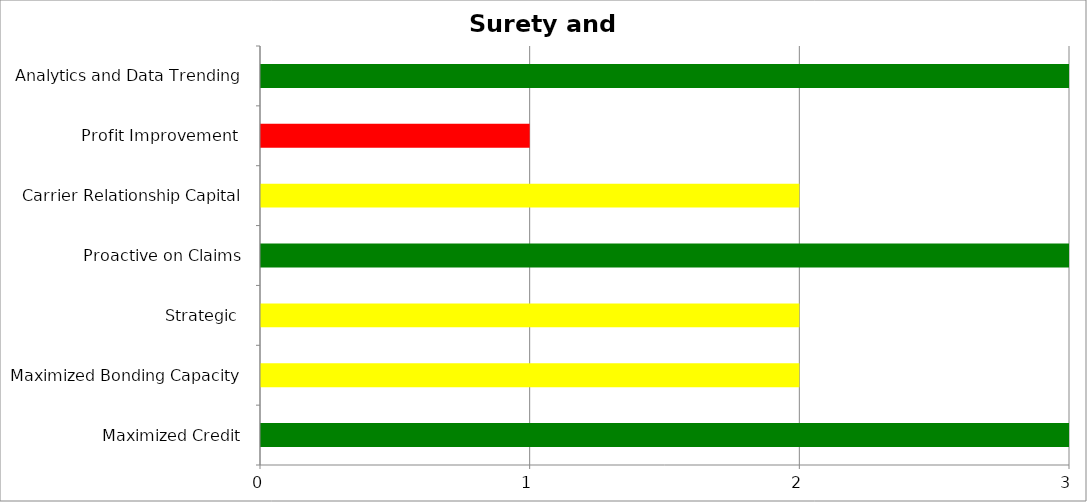
| Category | Low | Medium | High |
|---|---|---|---|
| Maximized Credit | 3 | 0 | 0 |
| Maximized Bonding Capacity | 0 | 2 | 0 |
| Strategic  | 0 | 2 | 0 |
| Proactive on Claims | 3 | 0 | 0 |
| Carrier Relationship Capital | 0 | 2 | 0 |
| Profit Improvement  | 0 | 0 | 1 |
| Analytics and Data Trending | 3 | 0 | 0 |